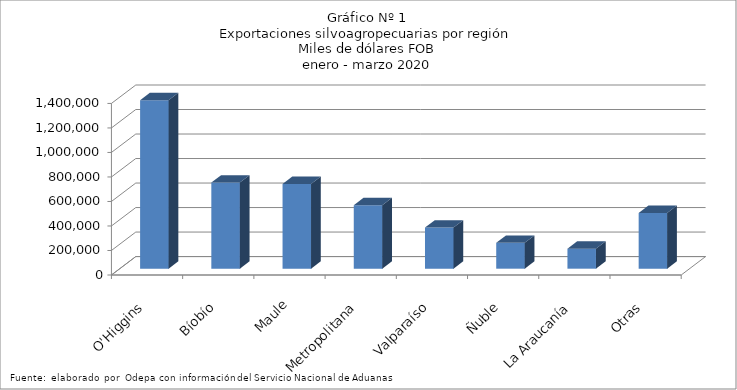
| Category | Series 0 |
|---|---|
| O'Higgins | 1374608.989 |
| Bíobío | 702460.519 |
| Maule | 691310.011 |
| Metropolitana | 518331.653 |
| Valparaíso | 335156.133 |
| Ñuble | 211046.817 |
| La Araucanía | 163268.509 |
| Otras | 455100.525 |